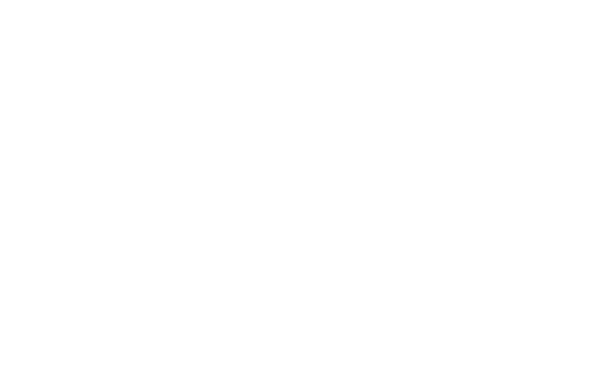
| Category | Number of countries/jurisdictions reporting this theme (37 in total) |
|---|---|
| Environmental education, sustainability | 21 |
| Local and global citizenship, peace  | 19 |
| Core literacy and lifelong learning | 19 |
| Health education, well-being, lifestyle | 19 |
| Moral/values education | 17 |
| Cultural identity and multiculturalism  | 15 |
| Career education, work studies, entrepreneurial education | 14 |
| Applied design skills and technologies, informatics  | 12 |
| Engaging with family and community | 11 |
| ICT, technology and media  | 9 |
| Career related, innovation and entrepreneurship | 8 |
| Creative expression | 7 |
| Regional and global engagement  | 6 |
| Media education  | 4 |